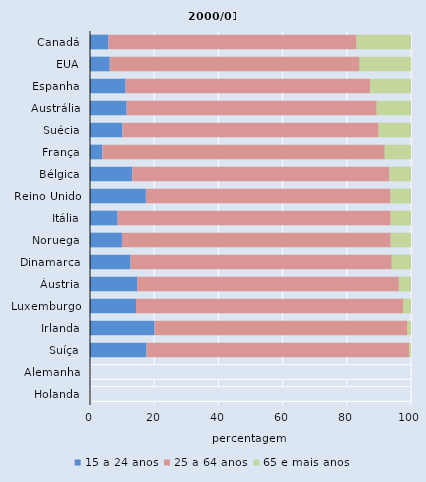
| Category | 15 a 24 anos | 25 a 64 anos | 65 e mais anos |
|---|---|---|---|
| Canadá | 5.751 | 77.296 | 16.953 |
| EUA | 6.157 | 77.846 | 15.997 |
| Espanha | 11.082 | 76.151 | 12.767 |
| Austrália | 11.411 | 77.906 | 10.683 |
| Suécia | 10.11 | 79.78 | 10.11 |
| França | 3.826 | 87.999 | 8.175 |
| Bélgica | 13.161 | 80.141 | 6.699 |
| Reino Unido | 17.404 | 76.227 | 6.37 |
| Itália | 8.609 | 85.031 | 6.36 |
| Noruega | 9.949 | 83.705 | 6.346 |
| Dinamarca | 12.618 | 81.388 | 5.994 |
| Áustria | 14.662 | 81.558 | 3.78 |
| Luxemburgo | 14.342 | 83.179 | 2.479 |
| Irlanda | 20.112 | 78.771 | 1.117 |
| Suíça | 17.591 | 81.768 | 0.641 |
| Alemanha | 0 | 100 | 0 |
| Holanda | 0 | 100 | 0 |